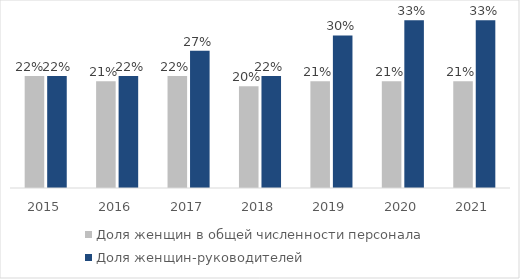
| Category | Доля женщин в общей численности персонала | Доля женщин-руководителей |
|---|---|---|
| 2015.0 | 0.22 | 0.22 |
| 2016.0 | 0.21 | 0.22 |
| 2017.0 | 0.22 | 0.27 |
| 2018.0 | 0.2 | 0.22 |
| 2019.0 | 0.21 | 0.3 |
| 2020.0 | 0.21 | 0.33 |
| 2021.0 | 0.21 | 0.33 |